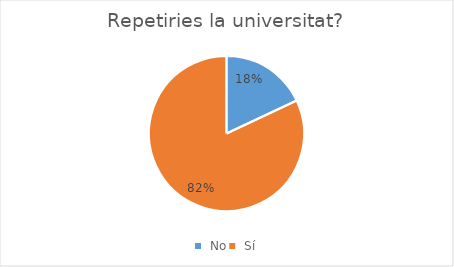
| Category | Series 0 |
|---|---|
|  No | 9 |
|  Sí | 41 |